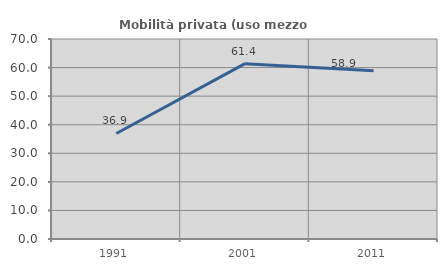
| Category | Mobilità privata (uso mezzo privato) |
|---|---|
| 1991.0 | 36.93 |
| 2001.0 | 61.376 |
| 2011.0 | 58.916 |